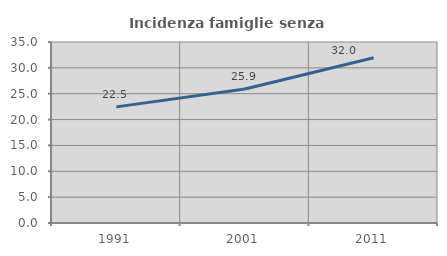
| Category | Incidenza famiglie senza nuclei |
|---|---|
| 1991.0 | 22.456 |
| 2001.0 | 25.897 |
| 2011.0 | 31.957 |